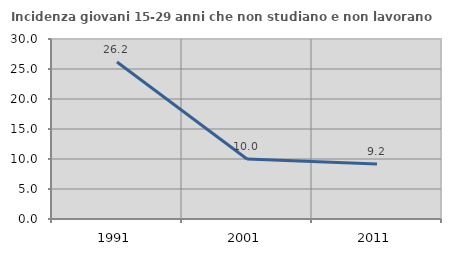
| Category | Incidenza giovani 15-29 anni che non studiano e non lavorano  |
|---|---|
| 1991.0 | 26.154 |
| 2001.0 | 10 |
| 2011.0 | 9.184 |